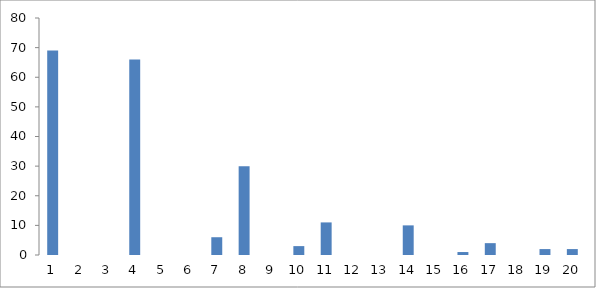
| Category | Series 0 |
|---|---|
| 0 | 69 |
| 1 | 0 |
| 2 | 0 |
| 3 | 66 |
| 4 | 0 |
| 5 | 0 |
| 6 | 6 |
| 7 | 30 |
| 8 | 0 |
| 9 | 3 |
| 10 | 11 |
| 11 | 0 |
| 12 | 0 |
| 13 | 10 |
| 14 | 0 |
| 15 | 1 |
| 16 | 4 |
| 17 | 0 |
| 18 | 2 |
| 19 | 2 |